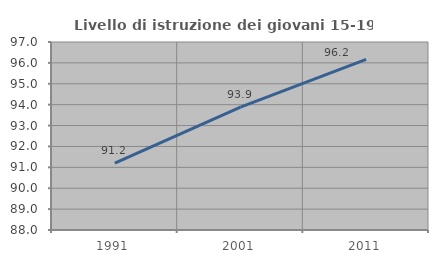
| Category | Livello di istruzione dei giovani 15-19 anni |
|---|---|
| 1991.0 | 91.204 |
| 2001.0 | 93.883 |
| 2011.0 | 96.168 |